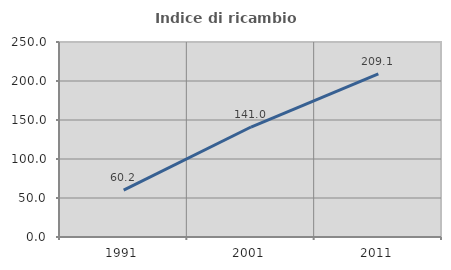
| Category | Indice di ricambio occupazionale  |
|---|---|
| 1991.0 | 60.169 |
| 2001.0 | 141.011 |
| 2011.0 | 209.143 |